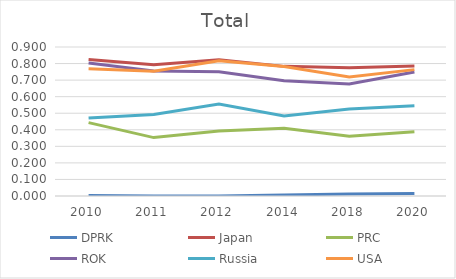
| Category | DPRK  | Japan  | PRC  | ROK  | Russia  | USA  |
|---|---|---|---|---|---|---|
| 2010.0 | 0.003 | 0.824 | 0.443 | 0.803 | 0.471 | 0.768 |
| 2011.0 | 0 | 0.793 | 0.353 | 0.755 | 0.493 | 0.753 |
| 2012.0 | 0.001 | 0.823 | 0.393 | 0.751 | 0.556 | 0.817 |
| 2014.0 | 0.006 | 0.783 | 0.409 | 0.696 | 0.483 | 0.782 |
| 2018.0 | 0.012 | 0.775 | 0.361 | 0.676 | 0.526 | 0.719 |
| 2020.0 | 0.015 | 0.786 | 0.388 | 0.749 | 0.545 | 0.763 |